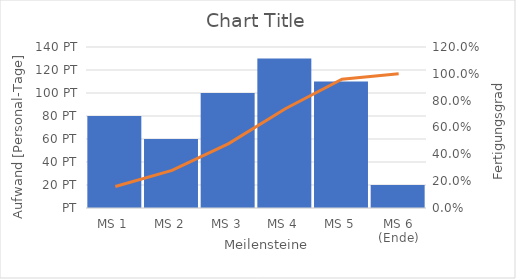
| Category | Series 0 |
|---|---|
| MS 1 | 80 |
| MS 2 | 60 |
| MS 3 | 100 |
| MS 4 | 130 |
| MS 5 | 110 |
| MS 6 (Ende) | 20 |